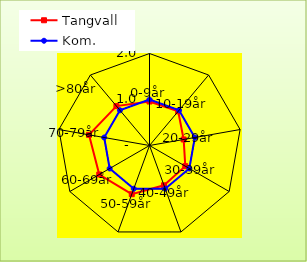
| Category | Tangvall | Kom. |
|---|---|---|
| 0-9år | 0.956 | 1 |
| 10-19år | 0.97 | 1 |
| 20-29år | 0.754 | 1 |
| 30-39år | 0.898 | 1 |
| 40-49år | 0.921 | 1 |
| 50-59år | 1.126 | 1 |
| 60-69år | 1.261 | 1 |
| 70-79år | 1.336 | 1 |
| >80år | 1.119 | 1 |